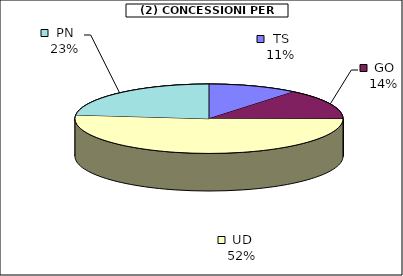
| Category | Series 0 |
|---|---|
| TS | 5760 |
| GO | 7500 |
| UD | 27272.75 |
| PN | 12284 |